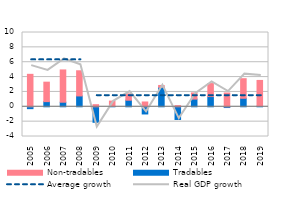
| Category | Tradables | Non-tradables |
|---|---|---|
| 2005.0 | -0.252 | 4.37 |
| 2006.0 | 0.694 | 2.62 |
| 2007.0 | 0.616 | 4.345 |
| 2008.0 | 1.461 | 3.387 |
| 2009.0 | -2.088 | 0.283 |
| 2010.0 | 0.04 | 0.727 |
| 2011.0 | 0.885 | 0.848 |
| 2012.0 | -0.966 | 0.647 |
| 2013.0 | 2.627 | 0.244 |
| 2014.0 | -1.707 | 0.158 |
| 2015.0 | 1.037 | 0.83 |
| 2016.0 | 1.377 | 1.75 |
| 2017.0 | -0.102 | 1.859 |
| 2018.0 | 1.146 | 2.636 |
| 2019.0 | 0.088 | 3.459 |